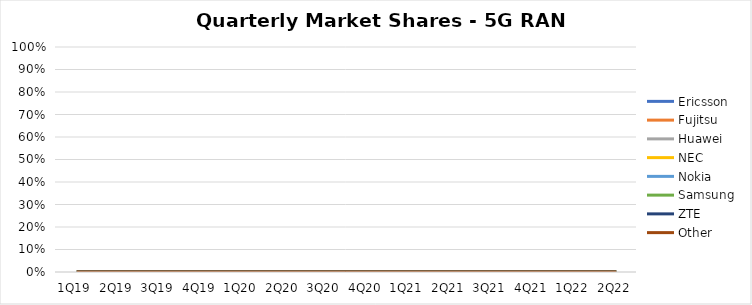
| Category | Ericsson | Fujitsu | Huawei | NEC | Nokia | Samsung | ZTE | Other |
|---|---|---|---|---|---|---|---|---|
| 1Q19 | 0 | 0 | 0 | 0 | 0 | 0 | 0 | 0 |
| 2Q19 | 0 | 0 | 0 | 0 | 0 | 0 | 0 | 0 |
| 3Q19 | 0 | 0 | 0 | 0 | 0 | 0 | 0 | 0 |
| 4Q19 | 0 | 0 | 0 | 0 | 0 | 0 | 0 | 0 |
| 1Q20 | 0 | 0 | 0 | 0 | 0 | 0 | 0 | 0 |
| 2Q20 | 0 | 0 | 0 | 0 | 0 | 0 | 0 | 0 |
| 3Q20 | 0 | 0 | 0 | 0 | 0 | 0 | 0 | 0 |
| 4Q20 | 0 | 0 | 0 | 0 | 0 | 0 | 0 | 0 |
| 1Q21 | 0 | 0 | 0 | 0 | 0 | 0 | 0 | 0 |
| 2Q21 | 0 | 0 | 0 | 0 | 0 | 0 | 0 | 0 |
| 3Q21 | 0 | 0 | 0 | 0 | 0 | 0 | 0 | 0 |
| 4Q21 | 0 | 0 | 0 | 0 | 0 | 0 | 0 | 0 |
| 1Q22 | 0 | 0 | 0 | 0 | 0 | 0 | 0 | 0 |
| 2Q22 | 0 | 0 | 0 | 0 | 0 | 0 | 0 | 0 |